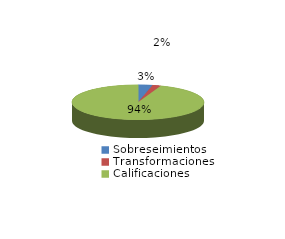
| Category | Series 0 |
|---|---|
| Sobreseimientos | 94 |
| Transformaciones | 55 |
| Calificaciones | 2546 |